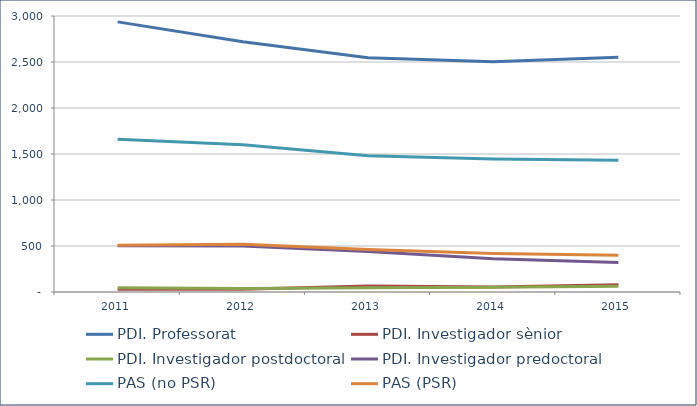
| Category | PDI. Professorat | PDI. Investigador sènior | PDI. Investigador postdoctoral | PDI. Investigador predoctoral | PAS (no PSR) | PAS (PSR) |
|---|---|---|---|---|---|---|
| 2011.0 | 2936 | 29 | 45 | 504 | 1660 | 508 |
| 2012.0 | 2720 | 29 | 37 | 500 | 1601 | 519 |
| 2013.0 | 2547 | 64 | 46 | 441 | 1480 | 461 |
| 2014.0 | 2502 | 53 | 52 | 361 | 1446 | 419 |
| 2015.0 | 2552 | 79 | 63 | 321 | 1432 | 400 |